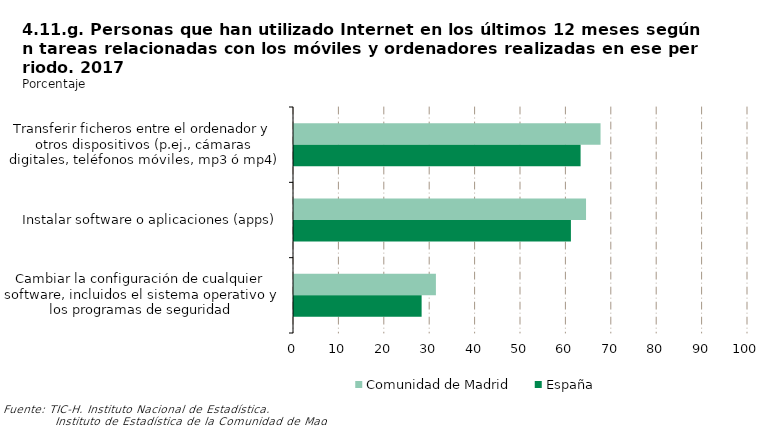
| Category | Comunidad de Madrid | España |
|---|---|---|
| Transferir ficheros entre el ordenador y otros dispositivos (p.ej., cámaras digitales, teléfonos móviles, mp3 ó mp4) | 67.522 | 63.125 |
| Instalar software o aplicaciones (apps) | 64.325 | 60.994 |
| Cambiar la configuración de cualquier software, incluidos el sistema operativo y los programas de seguridad | 31.257 | 28.11 |